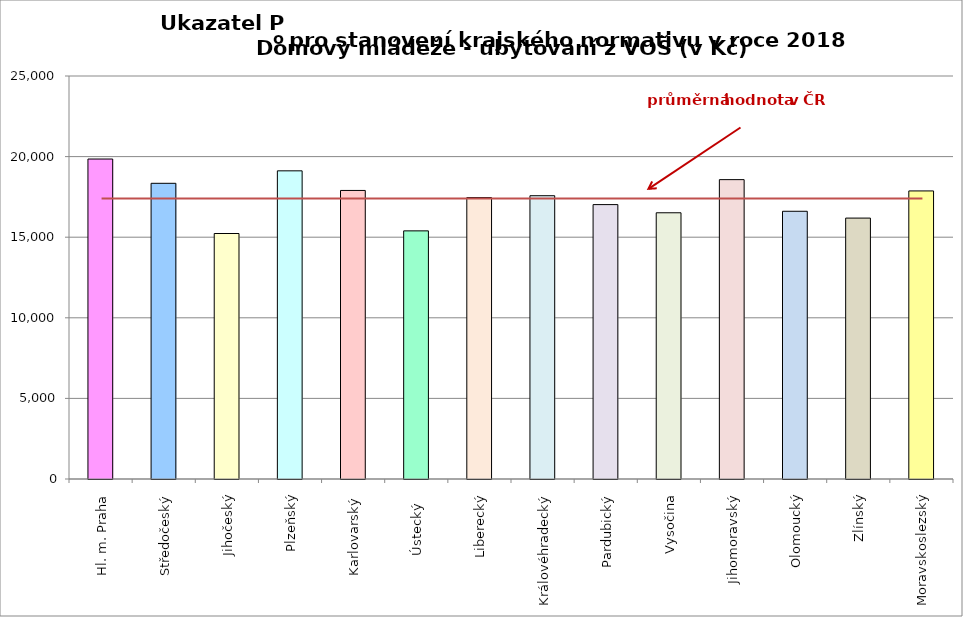
| Category | Series 0 |
|---|---|
| Hl. m. Praha | 19850 |
| Středočeský | 18343 |
| Jihočeský | 15229 |
| Plzeňský | 19117 |
| Karlovarský  | 17900 |
| Ústecký   | 15393 |
| Liberecký | 17460 |
| Královéhradecký | 17574 |
| Pardubický | 17022 |
| Vysočina | 16515 |
| Jihomoravský | 18571 |
| Olomoucký | 16608 |
| Zlínský | 16186 |
| Moravskoslezský | 17870 |